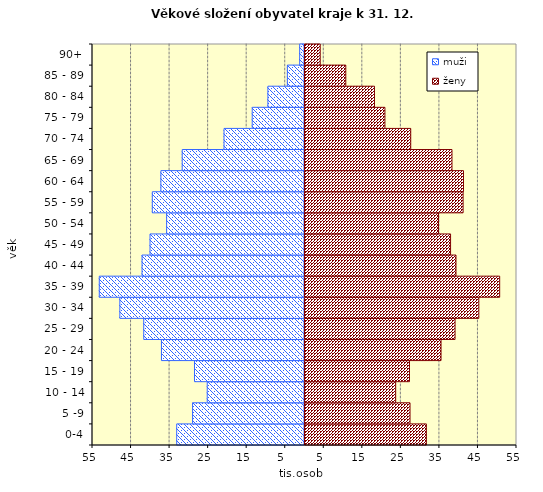
| Category | muži | ženy |
|---|---|---|
| 0-4 | -33153 | 31747 |
|  5 -9 | -29039 | 27505 |
|  10 - 14 | -25231 | 23785 |
| 15 - 19 | -28540 | 27369 |
| 20 - 24 | -37109 | 35552 |
| 25 - 29 | -41707 | 39189 |
| 30 - 34 | -47906 | 45355 |
| 35 - 39 | -53240 | 50765 |
| 40 - 44 | -42143 | 39432 |
| 45 - 49 | -40075 | 38026 |
| 50 - 54 | -35763 | 34891 |
| 55 - 59 | -39480 | 41275 |
| 60 - 64 | -37254 | 41378 |
| 65 - 69 | -31721 | 38389 |
| 70 - 74 | -20874 | 27688 |
| 75 - 79 | -13563 | 20996 |
| 80 - 84 | -9494 | 18282 |
| 85 - 89 | -4439 | 10843 |
| 90+ | -1251 | 4201 |